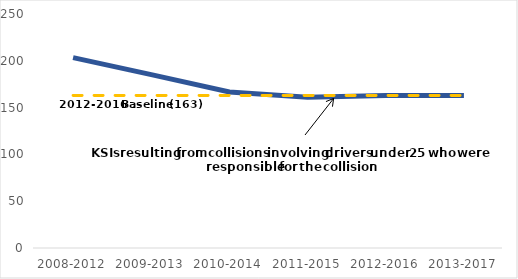
| Category | Series 0 | Series 1 |
|---|---|---|
| 2008-2012 | 203.4 | 163 |
| 2009-2013 | 185.2 | 163 |
| 2010-2014 | 166.6 | 163 |
| 2011-2015 | 161 | 163 |
| 2012-2016 | 163 | 163 |
| 2013-2017 | 163 | 163 |